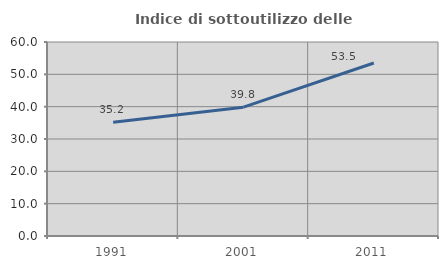
| Category | Indice di sottoutilizzo delle abitazioni  |
|---|---|
| 1991.0 | 35.156 |
| 2001.0 | 39.844 |
| 2011.0 | 53.498 |